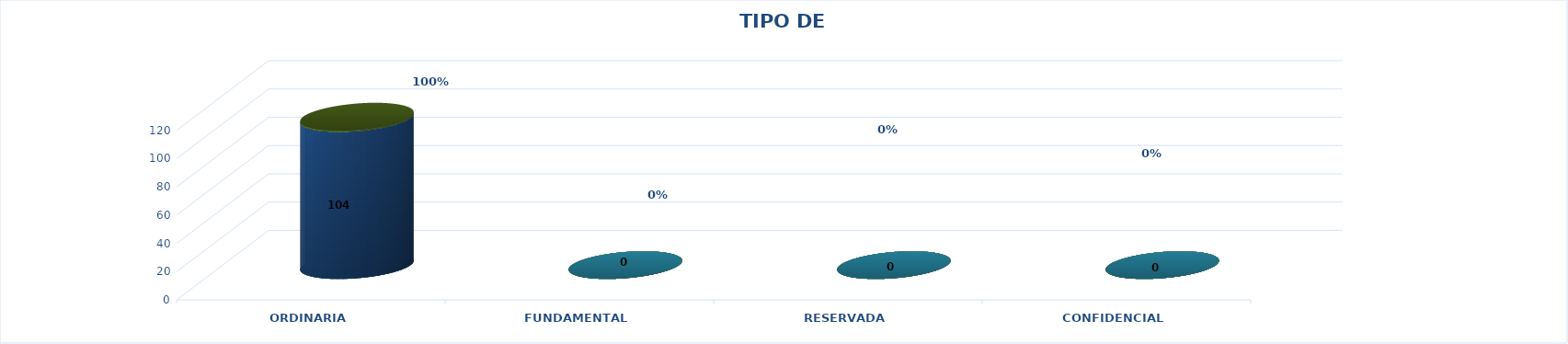
| Category | Series 0 | Series 2 | Series 1 | Series 3 | Series 4 |
|---|---|---|---|---|---|
| ORDINARIA |  |  |  | 104 | 1 |
| FUNDAMENTAL |  |  |  | 0 | 0 |
| RESERVADA |  |  |  | 0 | 0 |
| CONFIDENCIAL |  |  |  | 0 | 0 |